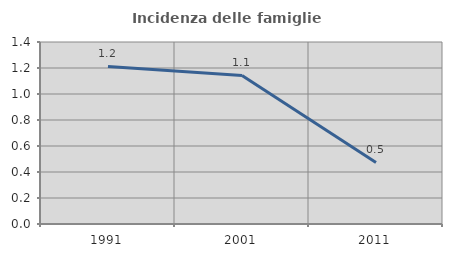
| Category | Incidenza delle famiglie numerose |
|---|---|
| 1991.0 | 1.212 |
| 2001.0 | 1.143 |
| 2011.0 | 0.474 |